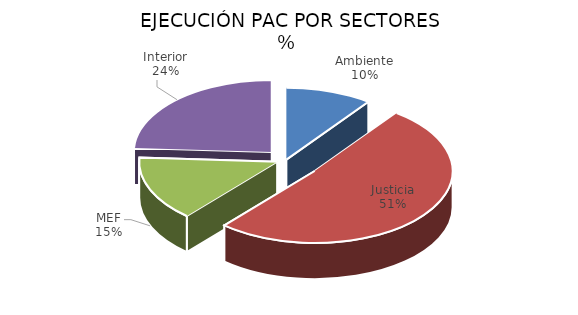
| Category | Series 0 |
|---|---|
| Ambiente | 0.101 |
| Justicia | 0.512 |
| MEF | 0.145 |
| Interior | 0.241 |